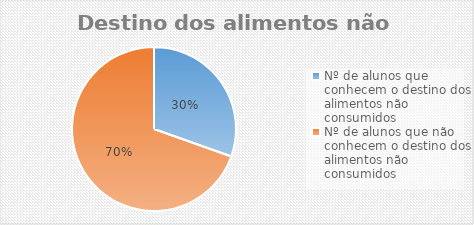
| Category | Series 6 |
|---|---|
| Nº de alunos que conhecem o destino dos alimentos não consumidos  | 28 |
| Nº de alunos que não conhecem o destino dos alimentos não consumidos  | 64 |